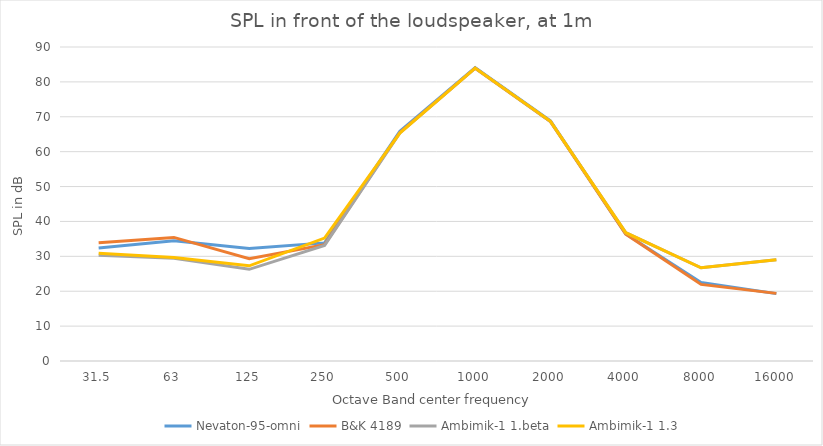
| Category | Nevaton-95-omni | B&K 4189 | Ambimik-1 1.beta | Ambimik-1 1.3 |
|---|---|---|---|---|
| 31.5 | 32.4 | 33.87 | 30.29 | 30.86 |
| 63.0 | 34.5 | 35.42 | 29.47 | 29.65 |
| 125.0 | 32.24 | 29.31 | 26.28 | 27.28 |
| 250.0 | 33.85 | 33.35 | 33.13 | 35.24 |
| 500.0 | 65.86 | 65.52 | 65.37 | 65.34 |
| 1000.0 | 84.08 | 83.93 | 83.97 | 83.96 |
| 2000.0 | 68.82 | 68.63 | 68.66 | 68.69 |
| 4000.0 | 36.42 | 36.38 | 36.77 | 36.77 |
| 8000.0 | 22.48 | 21.95 | 26.71 | 26.71 |
| 16000.0 | 19.31 | 19.38 | 28.99 | 29.04 |